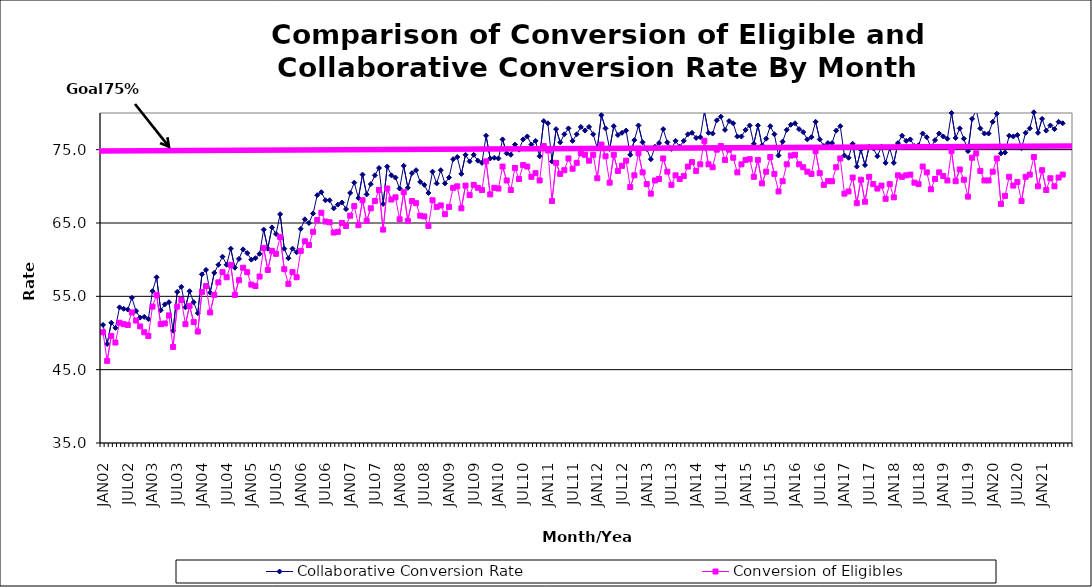
| Category | Collaborative Conversion Rate | Conversion of Eligibles |
|---|---|---|
| JAN02 | 51.1 | 50.1 |
| FEB02 | 48.5 | 46.2 |
| MAR02 | 51.4 | 49.6 |
| APR02 | 50.7 | 48.7 |
| MAY02 | 53.5 | 51.4 |
| JUN02 | 53.3 | 51.2 |
| JUL02 | 53.2 | 51.1 |
| AUG02 | 54.8 | 52.8 |
| SEP02 | 53 | 51.7 |
| OCT02 | 52.1 | 50.9 |
| NOV02 | 52.2 | 50.1 |
| DEC02 | 51.9 | 49.6 |
| JAN03 | 55.7 | 53.6 |
| FEB03 | 57.6 | 55.2 |
| MAR03 | 53.1 | 51.2 |
| APR03 | 53.9 | 51.3 |
| MAY03 | 54.2 | 52.4 |
| JUN03 | 50.3 | 48.1 |
| JUL03 | 55.6 | 53.6 |
| AUG03 | 56.3 | 54.5 |
| SEP03 | 53.5 | 51.2 |
| OCT03 | 55.7 | 53.7 |
| NOV03 | 54.2 | 51.5 |
| DEC03 | 52.7 | 50.2 |
| JAN04 | 58 | 55.6 |
| FEB04 | 58.6 | 56.4 |
| MAR04 | 55.5 | 52.8 |
| APR04 | 58.2 | 55.2 |
| MAY04 | 59.3 | 56.9 |
| JUN04 | 60.4 | 58.3 |
| JUL04 | 59.3 | 57.6 |
| AUG04 | 61.5 | 59.3 |
| SEP04 | 58.9 | 55.2 |
| OCT04 | 60.1 | 57.2 |
| NOV04 | 61.4 | 58.9 |
| DEC04 | 60.9 | 58.3 |
| JAN05 | 60 | 56.6 |
| FEB05 | 60.2 | 56.4 |
| MAR05 | 60.8 | 57.7 |
| APR05 | 64.1 | 61.6 |
| MAY05 | 61.5 | 58.6 |
| JUN05 | 64.4 | 61.2 |
| JUL05 | 63.5 | 60.8 |
| AUG05 | 66.2 | 63.1 |
| SEP05 | 61.5 | 58.7 |
| OCT05 | 60.2 | 56.7 |
| NOV05 | 61.5 | 58.3 |
| DEC05 | 61 | 57.6 |
| JAN06 | 64.2 | 61.2 |
| FEB06 | 65.5 | 62.5 |
| MAR06 | 65 | 62 |
| APR06 | 66.3 | 63.8 |
| MAY06 | 68.8 | 65.4 |
| JUN06 | 69.2 | 66.4 |
| JUL06 | 68.1 | 65.2 |
| AUG06 | 68.1 | 65.1 |
| SEP06 | 67 | 63.7 |
| OCT06 | 67.5 | 63.8 |
| NOV06 | 67.8 | 65 |
| DEC06 | 66.9 | 64.6 |
| JAN07 | 69.1 | 66 |
| FEB07 | 70.5 | 67.3 |
| MAR07 | 68.4 | 64.7 |
| APR07 | 71.6 | 68.1 |
| MAY07 | 68.9 | 65.3 |
| JUN07 | 70.3 | 67 |
| JUL07 | 71.5 | 68 |
| AUG07 | 72.5 | 69.5 |
| SEP07 | 67.6 | 64.1 |
| OCT07 | 72.7 | 69.7 |
| NOV07 | 71.5 | 68.2 |
| DEC07 | 71.2 | 68.5 |
| JAN08 | 69.7 | 65.5 |
| FEB08 | 72.8 | 69.2 |
| MAR08 | 69.8 | 65.3 |
| APR08 | 71.8 | 68 |
| MAY08 | 72.2 | 67.7 |
| JUN08 | 70.6 | 66 |
| JUL08 | 70.2 | 65.9 |
| AUG08 | 69.1 | 64.6 |
| SEP08 | 72 | 68.1 |
| OCT08 | 70.4 | 67.2 |
| NOV08 | 72.2 | 67.4 |
| DEC08 | 70.4 | 66.2 |
| JAN09 | 71.2 | 67.2 |
| FEB09 | 73.7 | 69.8 |
| MAR09 | 74 | 70 |
| APR09 | 71.7 | 67 |
| MAY09 | 74.3 | 70.1 |
| JUN09 | 73.4 | 68.8 |
| JUL09 | 74.3 | 70.2 |
| AUG09 | 73.5 | 69.8 |
| SEP09 | 73.2 | 69.5 |
| OCT09 | 76.9 | 73.4 |
| NOV09 | 73.8 | 68.9 |
| DEC09 | 73.9 | 69.8 |
| JAN10 | 73.8 | 69.7 |
| FEB10 | 76.4 | 72.7 |
| MAR10 | 74.5 | 70.8 |
| APR10 | 74.3 | 69.5 |
| MAY10 | 75.7 | 72.5 |
| JUN10 | 75 | 71 |
| JUL10 | 76.4 | 72.9 |
| AUG10 | 76.8 | 72.7 |
| SEP10 | 75.7 | 71.3 |
| OCT10 | 76.2 | 71.8 |
| NOV10 | 74.1 | 70.8 |
| DEC10 | 78.9 | 75.5 |
| JAN11 | 78.6 | 74.9 |
| FEB11 | 73.4 | 68 |
| MAR11 | 77.8 | 73.2 |
| APR11 | 76 | 71.7 |
| MAY11 | 77.1 | 72.2 |
| JUN11 | 77.9 | 73.8 |
| JUL11 | 76.2 | 72.4 |
| AUG11 | 77.1 | 73.2 |
| SEP11 | 78.1 | 74.5 |
| OCT11 | 77.6 | 74.3 |
| NOV11 | 78.1 | 73.5 |
| DEC11 | 77.1 | 74.3 |
| JAN12 | 75.2 | 71.1 |
| FEB12 | 79.7 | 75.7 |
| MAR12 | 77.9 | 74.1 |
| APR12 | 75.1 | 70.5 |
| MAY12 | 78.2 | 74.3 |
| JUN12 | 77 | 72.1 |
| JUL12 | 77.3 | 72.8 |
| AUG12 | 77.6 | 73.5 |
| SEP12 | 74.3 | 69.9 |
| OCT12 | 76.3 | 71.5 |
| NOV12 | 78.3 | 74.5 |
| DEC12 | 76 | 71.9 |
| JAN13 | 75.1 | 70.3 |
| FEB13 | 73.7 | 69 |
| MAR13 | 75.4 | 70.8 |
| APR13 | 75.9 | 71 |
| MAY13 | 77.8 | 73.8 |
| JUN13 | 76 | 72 |
| JUL13 | 75.1 | 70.2 |
| AUG13 | 76.2 | 71.5 |
| SEP13 | 75.4 | 71 |
| OCT13 | 76.2 | 71.4 |
| NOV13 | 77.1 | 72.7 |
| DEC13 | 77.3 | 73.3 |
| JAN14 | 76.6 | 72.1 |
| FEB14 | 76.7 | 73 |
| MAR14 | 80.2 | 76.2 |
| APR14 | 77.3 | 73 |
| MAY14 | 77.2 | 72.6 |
| JUN14 | 79 | 75 |
| JUL14 | 79.5 | 75.5 |
| AUG14 | 77.7 | 73.6 |
| SEP14 | 78.9 | 75 |
| OCT14 | 78.6 | 73.9 |
| NOV14 | 76.8 | 71.9 |
| DEC14 | 76.8 | 73 |
| JAN15 | 77.7 | 73.6 |
| FEB15 | 78.3 | 73.7 |
| MAR15 | 75.8 | 71.3 |
| APR15 | 78.3 | 73.6 |
| MAY15 | 75.6 | 70.4 |
| JUN15 | 76.5 | 72 |
| JUL15 | 78.2 | 74 |
| AUG15 | 77.1 | 71.7 |
| SEP15 | 74.2 | 69.3 |
| OCT15 | 76.1 | 70.7 |
| NOV15 | 77.7 | 73 |
| DEC15 | 78.4 | 74.2 |
| JAN16 | 78.6 | 74.3 |
| FEB16 | 77.8 | 73 |
| MAR16 | 77.4 | 72.6 |
| APR16 | 76.4 | 72 |
| MAY16 | 76.7 | 71.7 |
| JUN16 | 78.8 | 74.8 |
| JUL16 | 76.4 | 71.8 |
| AUG16 | 75.5 | 70.2 |
| SEP16 | 75.9 | 70.7 |
| OCT16 | 75.9 | 70.7 |
| NOV16 | 77.6 | 72.6 |
| DEC16 | 78.2 | 73.8 |
| JAN17 | 74.2 | 69 |
| FEB17 | 73.9 | 69.3 |
| MAR17 | 75.8 | 71.2 |
| APR17 | 72.7 | 67.7 |
| MAY17 | 75 | 70.9 |
| JUN17 | 72.9 | 67.9 |
| JUL17 | 75.4 | 71.3 |
| AUG17 | 75.2 | 70.3 |
| SEP17 | 74.1 | 69.7 |
| OCT17 | 75.4 | 70.1 |
| NOV17 | 73.2 | 68.3 |
| DEC17 | 75.2 | 70.3 |
| JAN18 | 73.2 | 68.5 |
| FEB18 | 75.9 | 71.5 |
| MAR18 | 76.9 | 71.3 |
| APR18 | 76.2 | 71.5 |
| MAY18 | 76.4 | 71.6 |
| JUN18 | 75.5 | 70.5 |
| JUL18 | 75.6 | 70.3 |
| AUG18 | 77.2 | 72.7 |
| SEP18 | 76.7 | 71.9 |
| OCT18 | 75.3 | 69.6 |
| NOV18 | 76.3 | 71 |
| DEC18 | 77.2 | 71.9 |
| JAN19 | 76.8 | 71.4 |
| FEB19 | 76.5 | 70.8 |
| MAR19 | 80 | 74.8 |
| APR19 | 76.6 | 70.7 |
| MAY19 | 77.9 | 72.3 |
| JUN19 | 76.5 | 70.9 |
| JUL19 | 74.8 | 68.6 |
| AUG19 | 79.2 | 73.9 |
| SEP19 | 80.4 | 74.5 |
| OCT19 | 77.9 | 72.1 |
| NOV19 | 77.2 | 70.8 |
| DEC19 | 77.2 | 70.8 |
| JAN20 | 78.8 | 72 |
| FEB20 | 79.9 | 73.8 |
| MAR20 | 74.5 | 67.6 |
| APR20 | 74.6 | 68.7 |
| MAY20 | 76.9 | 71.3 |
| JUN20 | 76.8 | 70.1 |
| JUL20 | 77 | 70.6 |
| AUG20 | 75.2 | 68 |
| SEP20 | 77.3 | 71.3 |
| OCT20 | 77.9 | 71.6 |
| NOV20 | 80.1 | 74 |
| DEC20 | 77.3 | 70 |
| JAN21 | 79.2 | 72.2 |
| FEB21 | 77.6 | 69.5 |
| MAR21 | 78.3 | 71.1 |
| APR21 | 77.8 | 70 |
| MAY21 | 78.8 | 71.2 |
| JUN21 | 78.6 | 71.6 |